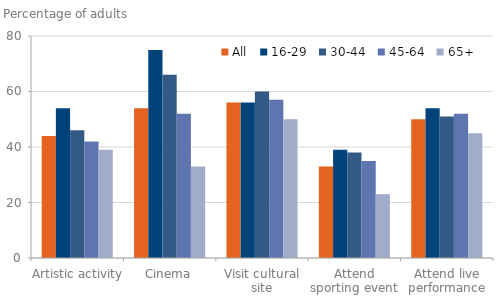
| Category | All | 16-29 | 30-44 | 45-64 | 65+ |
|---|---|---|---|---|---|
| Artistic activity | 44 | 54 | 46 | 42 | 39 |
| Cinema | 54 | 75 | 66 | 52 | 33 |
| Visit cultural site | 56 | 56 | 60 | 57 | 50 |
| Attend sporting event | 33 | 39 | 38 | 35 | 23 |
| Attend live performance | 50 | 54 | 51 | 52 | 45 |